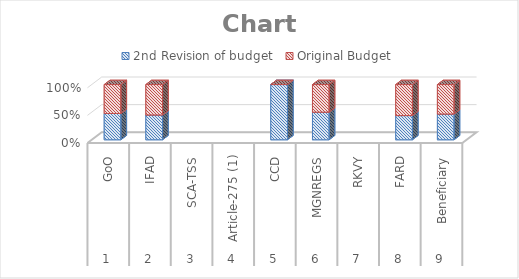
| Category | 2nd Revision of budget  | Original Budget |
|---|---|---|
| 0 | 188716651.493 | 207729167 |
| 1 | 550599903.642 | 674757228 |
| 2 | 0 | 0 |
| 3 | 0 | 0 |
| 4 | 9665000 | 0 |
| 5 | 120401800 | 120401800 |
| 6 | 0 | 0 |
| 7 | 79831000 | 102320000 |
| 8 | 37398708.793 | 42756140 |